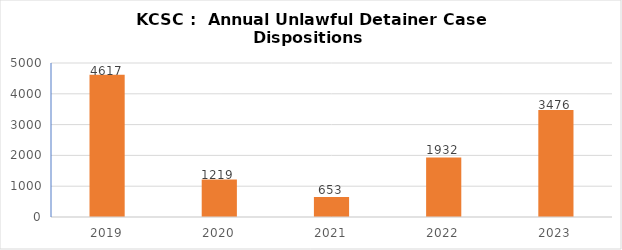
| Category | Series 1 |
|---|---|
| 2019.0 | 4617 |
| 2020.0 | 1219 |
| 2021.0 | 653 |
| 2022.0 | 1932 |
| 2023.0 | 3476 |